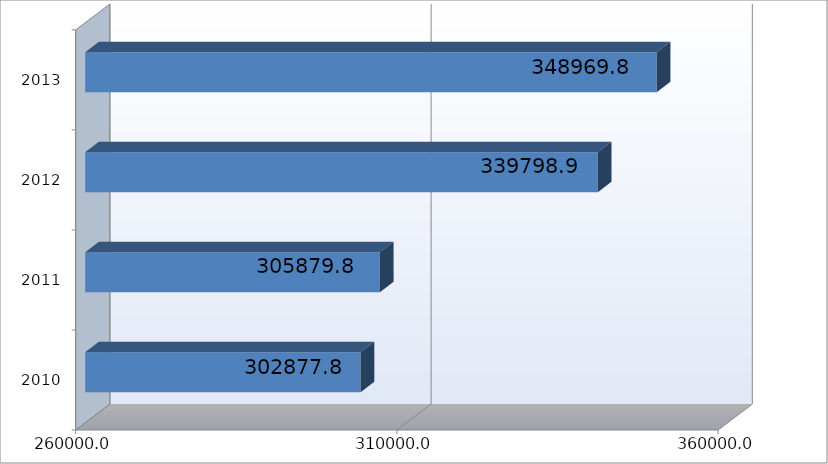
| Category | سثق |
|---|---|
| 2010 | 302877783.178 |
| 2011 | 305879827.338 |
| 2012 | 339798919.617 |
| 2013 | 348969821.04 |